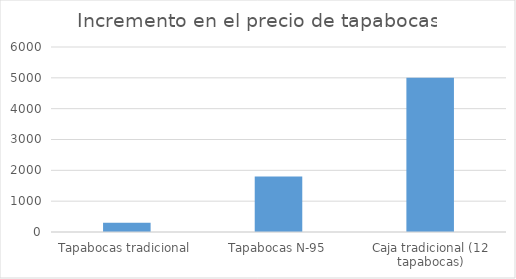
| Category | Series 0 |
|---|---|
| Tapabocas tradicional | 300 |
| Tapabocas N-95 | 1800 |
| Caja tradicional (12 tapabocas) | 5000 |